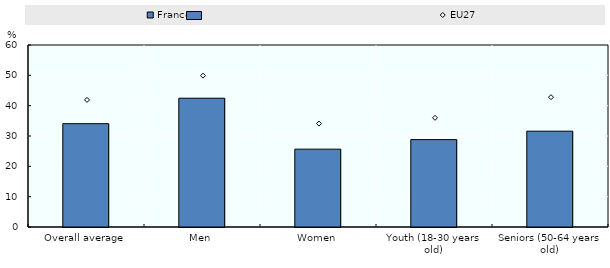
| Category | France |
|---|---|
| Overall average | 34.064 |
| Men | 42.457 |
| Women | 25.659 |
| Youth (18-30 years old) | 28.806 |
| Seniors (50-64 years old) | 31.591 |